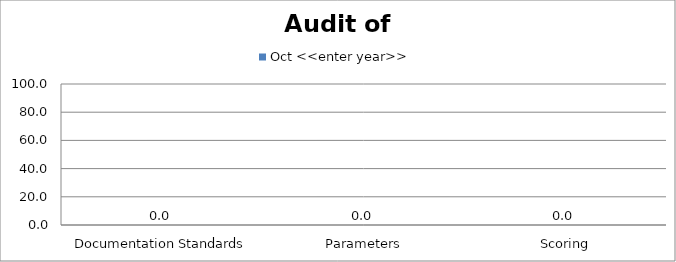
| Category | Oct <<enter year>> |
|---|---|
|  Documentation Standards | 0 |
|  Parameters | 0 |
|  Scoring | 0 |